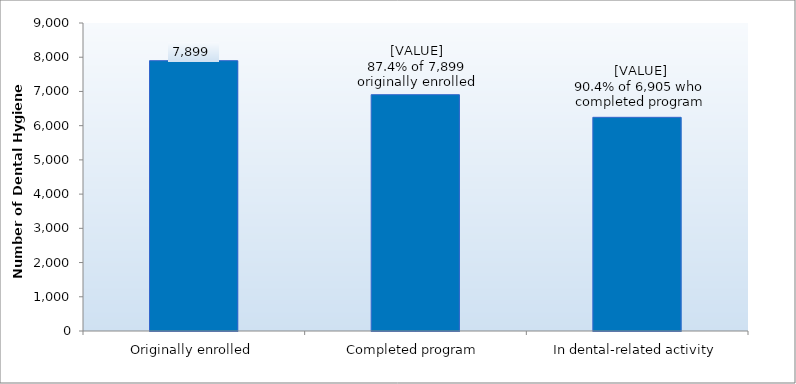
| Category | Series 0 |
|---|---|
| Originally enrolled | 7899 |
| Completed program | 6905 |
| In dental-related activity | 6244 |